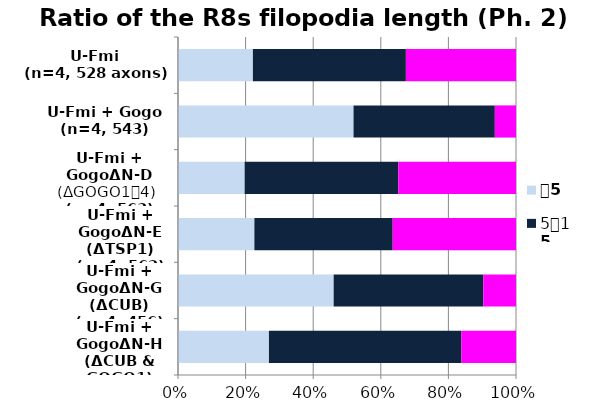
| Category | 〜5 | 5〜15 | 15〜 |
|---|---|---|---|
| U-Fmi + GogoΔN-H
(ΔCUB & GOGO1)
(n=4, 539) | 145 | 307 | 87 |
| U-Fmi + GogoΔN-G
(ΔCUB)
(n=4, 456) | 210 | 202 | 44 |
| U-Fmi + GogoΔN-E
(ΔTSP1)
(n=4, 562) | 127 | 230 | 205 |
| U-Fmi + GogoΔN-D
(ΔGOGO1〜4)
(n=4, 563) | 111 | 256 | 196 |
| U-Fmi + Gogo
(n=4, 543) | 282 | 227 | 34 |
| U-Fmi
(n=4, 528 axons) | 117 | 239 | 172 |